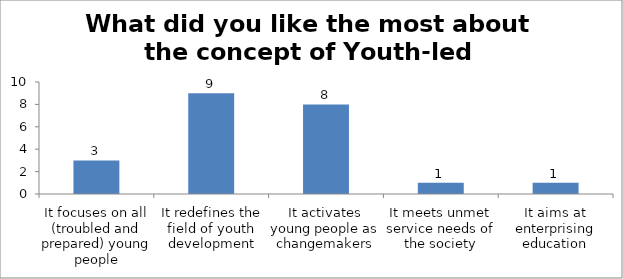
| Category | What did you like the most about the concept of Youth-led Changemaking? |
|---|---|
| It focuses on all (troubled and prepared) young people | 3 |
| It redefines the field of youth development | 9 |
| It activates young people as changemakers | 8 |
| It meets unmet service needs of the society | 1 |
| It aims at enterprising education | 1 |